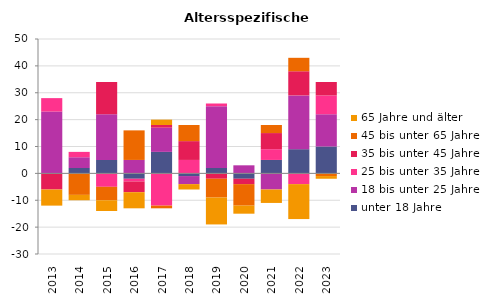
| Category | unter 18 Jahre | 18 bis unter 25 Jahre | 25 bis unter 35 Jahre | 35 bis unter 45 Jahre | 45 bis unter 65 Jahre | 65 Jahre und älter |
|---|---|---|---|---|---|---|
| 2013.0 | 0 | 23 | 5 | -6 | 0 | -6 |
| 2014.0 | 2 | 4 | 2 | 0 | -8 | -2 |
| 2015.0 | 5 | 17 | -5 | 12 | -5 | -4 |
| 2016.0 | -2 | 5 | -1 | -4 | 11 | -6 |
| 2017.0 | 8 | 9 | -12 | 1 | -1 | 2 |
| 2018.0 | -1 | -3 | 5 | 7 | 6 | -2 |
| 2019.0 | 2 | 23 | 1 | -2 | -7 | -10 |
| 2020.0 | -2 | 3 | 0 | -2 | -8 | -3 |
| 2021.0 | 5 | -6 | 4 | 6 | 3 | -5 |
| 2022.0 | 9 | 20 | -4 | 9 | 5 | -13 |
| 2023.0 | 10 | 12 | 7 | 5 | -1 | -1 |